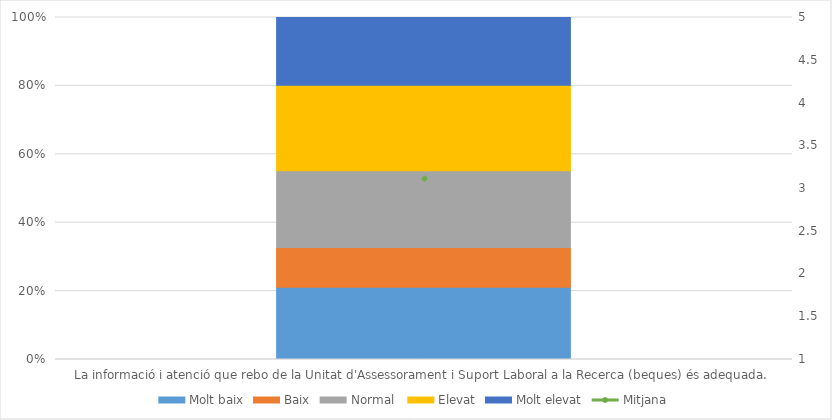
| Category | Molt baix | Baix | Normal  | Elevat | Molt elevat |
|---|---|---|---|---|---|
| La informació i atenció que rebo de la Unitat d'Assessorament i Suport Laboral a la Recerca (beques) és adequada. | 49 | 27 | 52 | 58 | 46 |